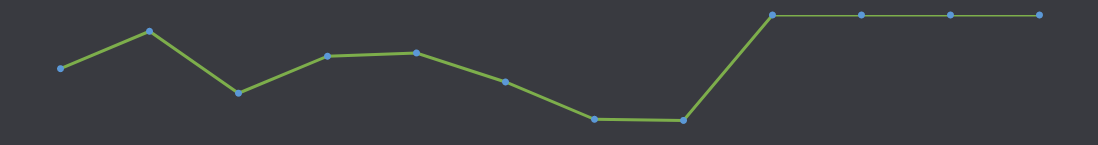
| Category | Rendelkezésre álló készpénz |
|---|---|
| JAN. | -28000 |
| FEBR. | -8500 |
| MÁRC. | -40800 |
| ÁPR. | -21500 |
| MÁJ. | -19800 |
| JÚN. | -34950 |
| JÚL. | -54400 |
| AUG. | -55000 |
| SZEPT. | 0 |
| OKT. | 0 |
| NOV. | 0 |
| DEC. | 0 |